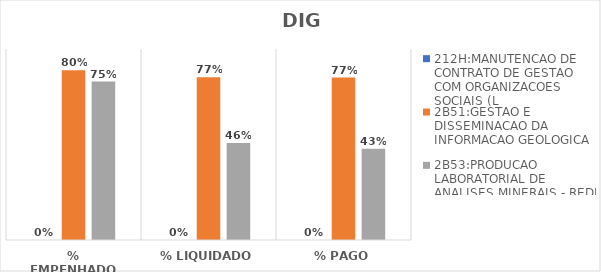
| Category | 212H:MANUTENCAO DE CONTRATO DE GESTAO COM ORGANIZACOES SOCIAIS (L | 2B51:GESTAO E DISSEMINACAO DA INFORMACAO GEOLOGICA | 2B53:PRODUCAO LABORATORIAL DE ANALISES MINERAIS - REDE LAMIN |
|---|---|---|---|
| % EMPENHADO | 0 | 0.8 | 0.747 |
| % LIQUIDADO | 0 | 0.767 | 0.457 |
| % PAGO | 0 | 0.765 | 0.43 |